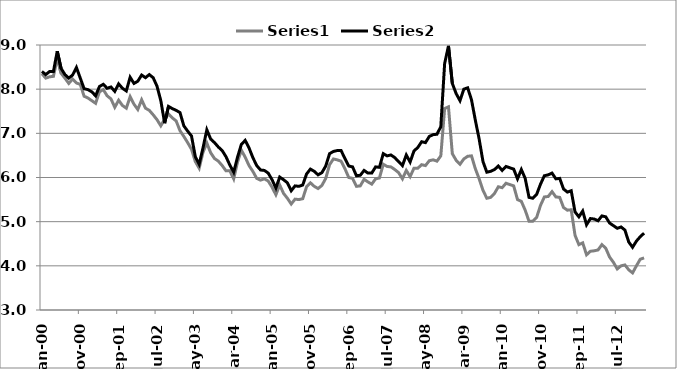
| Category | Series 1 | Series 2 |
|---|---|---|
| 2000-01-01 | 8.35 | 8.4 |
| 2000-02-01 | 8.25 | 8.33 |
| 2000-03-01 | 8.28 | 8.4 |
| 2000-04-01 | 8.29 | 8.4 |
| 2000-05-01 | 8.7 | 8.86 |
| 2000-06-01 | 8.36 | 8.47 |
| 2000-07-01 | 8.25 | 8.33 |
| 2000-08-01 | 8.13 | 8.25 |
| 2000-09-01 | 8.23 | 8.32 |
| 2000-10-01 | 8.14 | 8.49 |
| 2000-11-01 | 8.11 | 8.25 |
| 2000-12-01 | 7.84 | 8.01 |
| 2001-01-01 | 7.8 | 7.99 |
| 2001-02-01 | 7.74 | 7.94 |
| 2001-03-01 | 7.68 | 7.85 |
| 2001-04-01 | 7.94 | 8.06 |
| 2001-05-01 | 7.99 | 8.11 |
| 2001-06-01 | 7.85 | 8.02 |
| 2001-07-01 | 7.78 | 8.05 |
| 2001-08-01 | 7.59 | 7.95 |
| 2001-09-01 | 7.75 | 8.12 |
| 2001-10-01 | 7.63 | 8.02 |
| 2001-11-01 | 7.57 | 7.96 |
| 2001-12-01 | 7.83 | 8.27 |
| 2002-01-01 | 7.66 | 8.13 |
| 2002-02-01 | 7.54 | 8.18 |
| 2002-03-01 | 7.76 | 8.32 |
| 2002-04-01 | 7.57 | 8.26 |
| 2002-05-01 | 7.52 | 8.33 |
| 2002-06-01 | 7.42 | 8.26 |
| 2002-07-01 | 7.31 | 8.07 |
| 2002-08-01 | 7.17 | 7.74 |
| 2002-09-01 | 7.32 | 7.23 |
| 2002-10-01 | 7.44 | 7.61 |
| 2002-11-01 | 7.35 | 7.56 |
| 2002-12-01 | 7.28 | 7.52 |
| 2003-01-01 | 7.06 | 7.47 |
| 2003-02-01 | 6.93 | 7.17 |
| 2003-03-01 | 6.79 | 7.05 |
| 2003-04-01 | 6.64 | 6.94 |
| 2003-05-01 | 6.36 | 6.47 |
| 2003-06-01 | 6.21 | 6.3 |
| 2003-07-01 | 6.57 | 6.67 |
| 2003-08-01 | 6.78 | 7.08 |
| 2003-09-01 | 6.56 | 6.87 |
| 2003-10-01 | 6.43 | 6.79 |
| 2003-11-01 | 6.37 | 6.69 |
| 2003-12-01 | 6.27 | 6.61 |
| 2004-01-01 | 6.15 | 6.47 |
| 2004-02-01 | 6.15 | 6.28 |
| 2004-03-01 | 5.97 | 6.12 |
| 2004-04-01 | 6.35 | 6.46 |
| 2004-05-01 | 6.62 | 6.75 |
| 2004-06-01 | 6.46 | 6.84 |
| 2004-07-01 | 6.27 | 6.67 |
| 2004-08-01 | 6.14 | 6.45 |
| 2004-09-01 | 5.98 | 6.27 |
| 2004-10-01 | 5.94 | 6.17 |
| 2004-11-01 | 5.97 | 6.16 |
| 2004-12-01 | 5.92 | 6.1 |
| 2005-01-01 | 5.78 | 5.95 |
| 2005-02-01 | 5.61 | 5.76 |
| 2005-03-01 | 5.83 | 6.01 |
| 2005-04-01 | 5.64 | 5.95 |
| 2005-05-01 | 5.53 | 5.88 |
| 2005-06-01 | 5.4 | 5.7 |
| 2005-07-01 | 5.51 | 5.81 |
| 2005-08-01 | 5.5 | 5.8 |
| 2005-09-01 | 5.52 | 5.83 |
| 2005-10-01 | 5.79 | 6.08 |
| 2005-11-01 | 5.88 | 6.19 |
| 2005-12-01 | 5.8 | 6.14 |
| 2006-01-01 | 5.75 | 6.06 |
| 2006-02-01 | 5.82 | 6.11 |
| 2006-03-01 | 5.98 | 6.26 |
| 2006-04-01 | 6.29 | 6.54 |
| 2006-05-01 | 6.42 | 6.59 |
| 2006-06-01 | 6.4 | 6.61 |
| 2006-07-01 | 6.37 | 6.61 |
| 2006-08-01 | 6.2 | 6.43 |
| 2006-09-01 | 6 | 6.26 |
| 2006-10-01 | 5.98 | 6.24 |
| 2006-11-01 | 5.8 | 6.04 |
| 2006-12-01 | 5.81 | 6.05 |
| 2007-01-01 | 5.96 | 6.16 |
| 2007-02-01 | 5.9 | 6.1 |
| 2007-03-01 | 5.85 | 6.1 |
| 2007-04-01 | 5.97 | 6.24 |
| 2007-05-01 | 5.99 | 6.23 |
| 2007-06-01 | 6.3 | 6.54 |
| 2007-07-01 | 6.25 | 6.49 |
| 2007-08-01 | 6.24 | 6.51 |
| 2007-09-01 | 6.18 | 6.45 |
| 2007-10-01 | 6.11 | 6.36 |
| 2007-11-01 | 5.97 | 6.27 |
| 2007-12-01 | 6.16 | 6.51 |
| 2008-01-01 | 6.02 | 6.35 |
| 2008-02-01 | 6.21 | 6.6 |
| 2008-03-01 | 6.21 | 6.68 |
| 2008-04-01 | 6.29 | 6.81 |
| 2008-05-01 | 6.27 | 6.79 |
| 2008-06-01 | 6.38 | 6.93 |
| 2008-07-01 | 6.4 | 6.97 |
| 2008-08-01 | 6.37 | 6.98 |
| 2008-09-01 | 6.49 | 7.15 |
| 2008-10-01 | 7.56 | 8.58 |
| 2008-11-01 | 7.6 | 8.98 |
| 2008-12-01 | 6.54 | 8.13 |
| 2009-01-01 | 6.39 | 7.9 |
| 2009-02-01 | 6.3 | 7.74 |
| 2009-03-01 | 6.42 | 8 |
| 2009-04-01 | 6.48 | 8.03 |
| 2009-05-01 | 6.49 | 7.76 |
| 2009-06-01 | 6.2 | 7.3 |
| 2009-07-01 | 5.97 | 6.87 |
| 2009-08-01 | 5.71 | 6.36 |
| 2009-09-01 | 5.53 | 6.12 |
| 2009-10-01 | 5.55 | 6.14 |
| 2009-11-01 | 5.64 | 6.18 |
| 2009-12-01 | 5.79 | 6.26 |
| 2010-01-01 | 5.77 | 6.16 |
| 2010-02-01 | 5.87 | 6.25 |
| 2010-03-01 | 5.84 | 6.22 |
| 2010-04-01 | 5.81 | 6.19 |
| 2010-05-01 | 5.5 | 5.97 |
| 2010-06-01 | 5.46 | 6.18 |
| 2010-07-01 | 5.26 | 5.98 |
| 2010-08-01 | 5.01 | 5.55 |
| 2010-09-01 | 5.01 | 5.53 |
| 2010-10-01 | 5.1 | 5.62 |
| 2010-11-01 | 5.37 | 5.85 |
| 2010-12-01 | 5.56 | 6.04 |
| 2011-01-01 | 5.57 | 6.06 |
| 2011-02-01 | 5.68 | 6.1 |
| 2011-03-01 | 5.56 | 5.97 |
| 2011-04-01 | 5.55 | 5.98 |
| 2011-05-01 | 5.32 | 5.74 |
| 2011-06-01 | 5.26 | 5.67 |
| 2011-07-01 | 5.27 | 5.7 |
| 2011-08-01 | 4.69 | 5.22 |
| 2011-09-01 | 4.48 | 5.11 |
| 2011-10-01 | 4.52 | 5.24 |
| 2011-11-01 | 4.25 | 4.93 |
| 2011-12-01 | 4.33 | 5.07 |
| 2012-01-01 | 4.34 | 5.06 |
| 2012-02-01 | 4.36 | 5.02 |
| 2012-03-01 | 4.48 | 5.13 |
| 2012-04-01 | 4.4 | 5.11 |
| 2012-05-01 | 4.2 | 4.97 |
| 2012-06-01 | 4.08 | 4.91 |
| 2012-07-01 | 3.93 | 4.85 |
| 2012-08-01 | 4 | 4.88 |
| 2012-09-01 | 4.02 | 4.81 |
| 2012-10-01 | 3.91 | 4.54 |
| 2012-11-01 | 3.84 | 4.42 |
| 2012-12-01 | 4 | 4.56 |
| 2013-01-01 | 4.15 | 4.66 |
| 2013-02-01 | 4.18 | 4.74 |